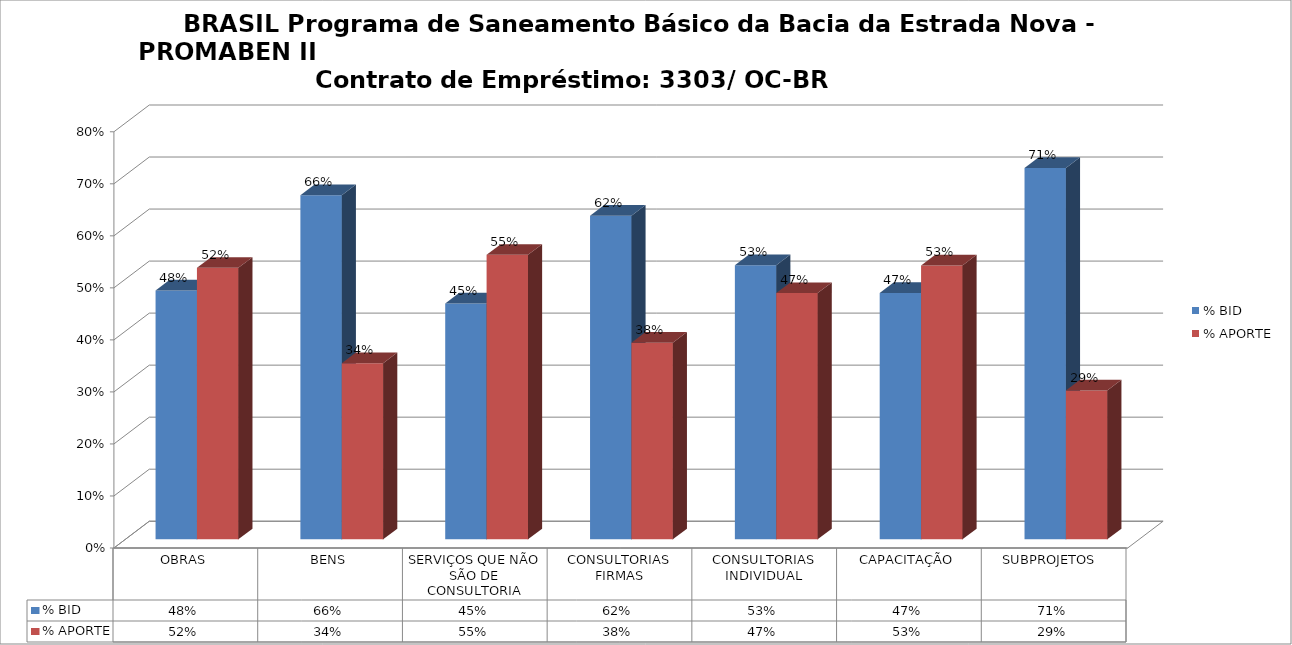
| Category | % BID | % APORTE |
|---|---|---|
| OBRAS | 0.478 | 0.522 |
| BENS | 0.661 | 0.339 |
| SERVIÇOS QUE NÃO SÃO DE CONSULTORIA | 0.453 | 0.547 |
| CONSULTORIAS FIRMAS | 0.622 | 0.378 |
| CONSULTORIAS INDIVIDUAL | 0.527 | 0.473 |
| CAPACITAÇÃO | 0.473 | 0.527 |
| SUBPROJETOS  | 0.714 | 0.286 |